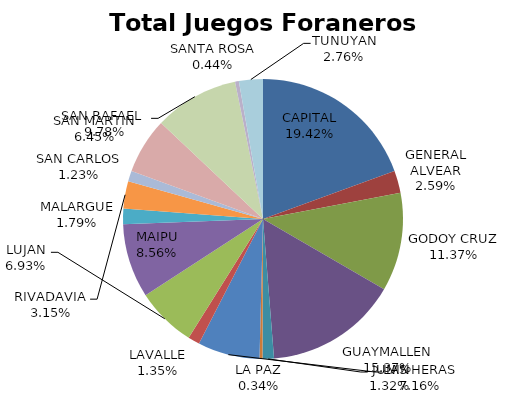
| Category | Total Juegos Foraneros Recaudación  |
|---|---|
| CAPITAL | 5712463 |
| GENERAL ALVEAR | 761479 |
| GODOY CRUZ | 3344384 |
| GUAYMALLEN | 4519645 |
| JUNIN | 387270 |
| LA PAZ | 99837 |
| LAS HERAS | 2106286 |
| LAVALLE | 396503 |
| LUJAN | 2039182 |
| MAIPU | 2518467 |
| MALARGUE | 527268 |
| RIVADAVIA | 926204 |
| SAN CARLOS | 360781 |
| SAN MARTIN | 1896467 |
| SAN RAFAEL  | 2876223 |
| SANTA ROSA | 129700 |
| TUNUYAN | 812985 |